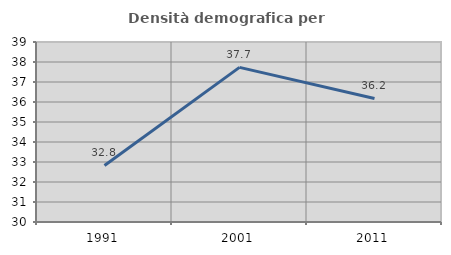
| Category | Densità demografica |
|---|---|
| 1991.0 | 32.828 |
| 2001.0 | 37.732 |
| 2011.0 | 36.177 |